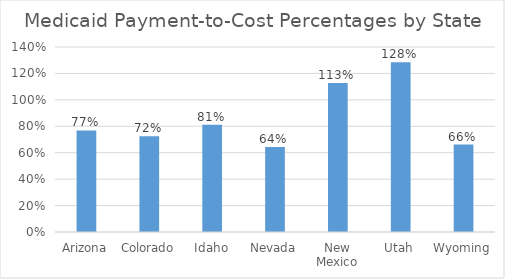
| Category | Payment-to-Cost Percentage |
|---|---|
| Arizona | 0.768 |
| Colorado | 0.725 |
| Idaho | 0.812 |
| Nevada | 0.644 |
| New Mexico | 1.128 |
| Utah | 1.285 |
| Wyoming | 0.662 |